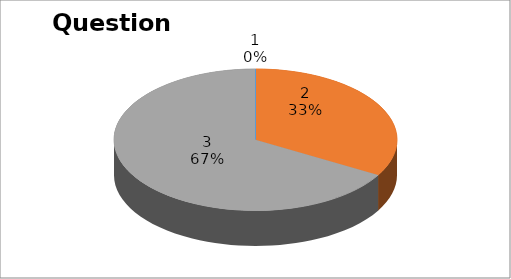
| Category | Series 0 |
|---|---|
| 0 | 0 |
| 1 | 12 |
| 2 | 24 |